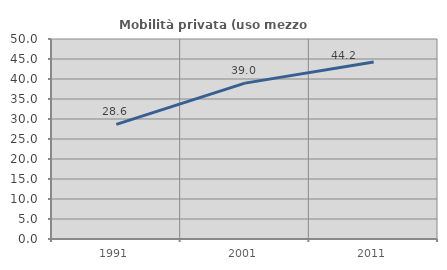
| Category | Mobilità privata (uso mezzo privato) |
|---|---|
| 1991.0 | 28.646 |
| 2001.0 | 38.971 |
| 2011.0 | 44.231 |